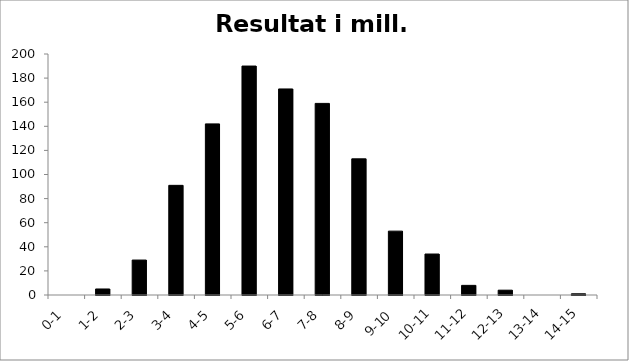
| Category | Resultat |
|---|---|
|  0-1 | 0 |
|  1-2 | 5 |
|  2-3 | 29 |
|  3-4 | 91 |
|  4-5 | 142 |
|  5-6 | 190 |
|  6-7 | 171 |
|  7-8 | 159 |
|  8-9 | 113 |
|  9-10 | 53 |
|  10-11 | 34 |
|  11-12 | 8 |
|  12-13 | 4 |
|  13-14 | 0 |
|  14-15 | 1 |